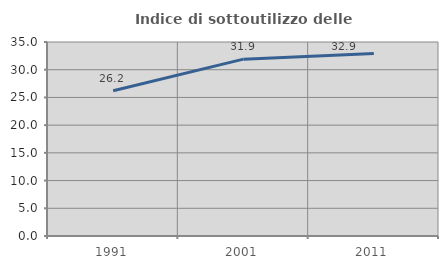
| Category | Indice di sottoutilizzo delle abitazioni  |
|---|---|
| 1991.0 | 26.193 |
| 2001.0 | 31.907 |
| 2011.0 | 32.913 |